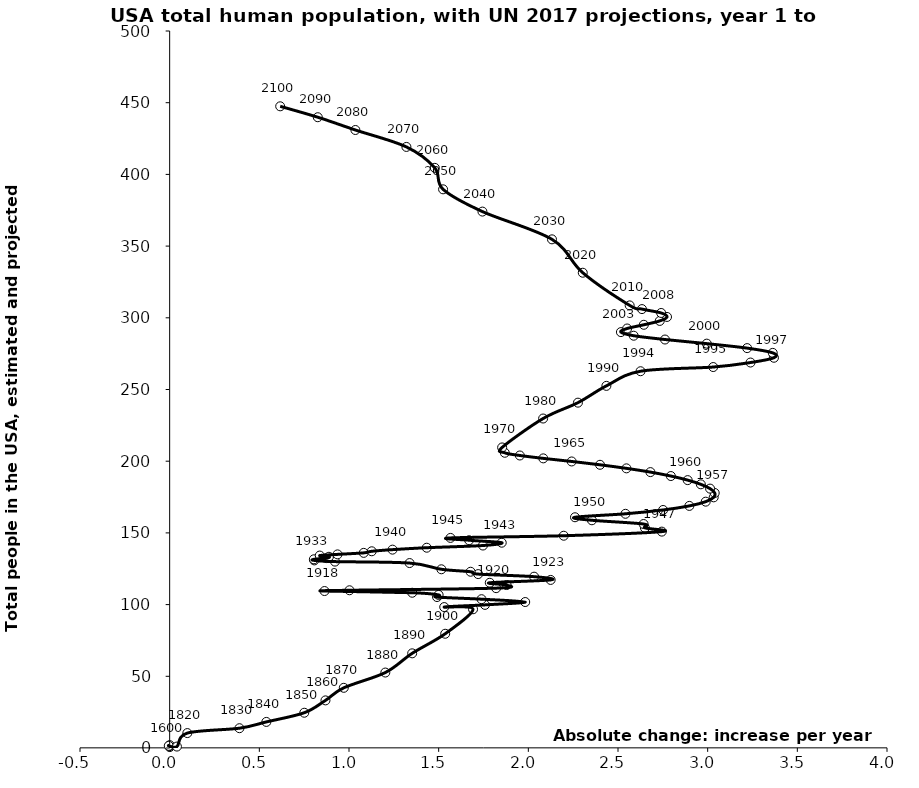
| Category | Series 0 |
|---|---|
| 0.00066 | 0.64 |
| 0.0009072715143428952 | 1.3 |
| 0.00033333333333333327 | 2 |
| -0.005 | 1.5 |
| 0.040494261848412885 | 1 |
| 0.09852621255219518 | 10.409 |
| 0.38917395290568474 | 13.808 |
| 0.5391515117391295 | 18.192 |
| 0.7506387753965683 | 24.591 |
| 0.8687885371431469 | 33.205 |
| 0.9708988578854225 | 41.967 |
| 1.2025425032091952 | 52.623 |
| 1.3522845372838561 | 66.018 |
| 1.536461801221178 | 79.669 |
| 1.6916889325819204 | 96.747 |
| 1.5309865428085487 | 98.277 |
| 1.7583401302283477 | 99.809 |
| 1.9825649985552047 | 101.794 |
| 1.739046362488594 | 103.774 |
| 1.4908346477825773 | 105.272 |
| 1.499699351879208 | 106.756 |
| 1.352649554511359 | 108.271 |
| 0.8635264696495071 | 109.461 |
| 1.0027544692850299 | 109.998 |
| 1.8203930589048483 | 111.467 |
| 1.8787958153062547 | 113.639 |
| 1.7849342425182755 | 115.224 |
| 2.12440026410151 | 117.209 |
| 2.0321030508599804 | 119.473 |
| 1.7202740479309924 | 121.273 |
| 1.6780363401763907 | 122.914 |
| 1.5150822207528059 | 124.629 |
| 1.3377881388199349 | 128.974 |
| 0.9219292260509206 | 129.981 |
| 0.8066880727945573 | 130.818 |
| 0.8040808068837748 | 131.594 |
| 0.8755198928390797 | 132.426 |
| 0.8880347692108188 | 133.345 |
| 0.8369323573595722 | 134.202 |
| 0.9360084619691094 | 135.019 |
| 1.082015352972661 | 136.074 |
| 1.1268603266380381 | 137.183 |
| 1.2426229330765608 | 138.328 |
| 1.4334747977454612 | 139.668 |
| 1.746868160220913 | 141.195 |
| 1.8516802498341889 | 143.162 |
| 1.6696930892619122 | 144.898 |
| 1.565923906012955 | 146.501 |
| 2.1974037096032646 | 148.03 |
| 2.744408097684399 | 150.896 |
| 2.6500250717142677 | 153.519 |
| 2.6427247271640653 | 156.196 |
| 2.354474408570894 | 158.804 |
| 2.260227999999998 | 160.905 |
| 2.5415775000000025 | 163.325 |
| 2.751381000000009 | 165.988 |
| 2.897825999999995 | 168.828 |
| 2.989163999999988 | 171.784 |
| 3.033657000000005 | 174.806 |
| 3.0392585000000025 | 177.851 |
| 3.0133584999999954 | 180.884 |
| 2.9618850000000094 | 183.878 |
| 2.88851600000001 | 186.808 |
| 2.794756499999991 | 189.655 |
| 2.6806529999999924 | 192.398 |
| 2.547051499999995 | 195.016 |
| 2.3996645 | 197.492 |
| 2.241689000000008 | 199.816 |
| 2.083194000000006 | 201.975 |
| 1.9525979999999947 | 203.982 |
| 1.8687406666666675 | 205.88 |
| 1.8538660000000107 | 209.588 |
| 2.0823979999999986 | 229.763 |
| 2.2766898000000024 | 240.824 |
| 2.435271777777776 | 252.53 |
| 2.625779799999992 | 262.742 |
| 3.0309290000000146 | 265.659 |
| 3.238851000000011 | 268.803 |
| 3.3695894999999894 | 272.137 |
| 3.3628630000000044 | 275.543 |
| 3.2200875000000053 | 278.862 |
| 2.9950570000000027 | 281.983 |
| 2.7620344999999986 | 284.852 |
| 2.5876164999999958 | 287.507 |
| 2.5162385000000143 | 290.028 |
| 2.550938500000001 | 292.539 |
| 2.6440159999999935 | 295.13 |
| 2.7328369999999893 | 297.827 |
| 2.773355500000008 | 300.595 |
| 2.740593500000017 | 303.374 |
| 2.633661999999987 | 306.076 |
| 2.5650289999999814 | 308.641 |
| 2.3035139500000015 | 331.432 |
| 2.131860900000001 | 354.712 |
| 1.743999649999998 | 374.069 |
| 1.5246736499999998 | 389.592 |
| 1.4784984000000008 | 404.562 |
| 1.320111 | 419.162 |
| 1.0355658000000005 | 430.964 |
| 0.8259355499999999 | 439.873 |
| 0.6163052999999992 | 447.483 |